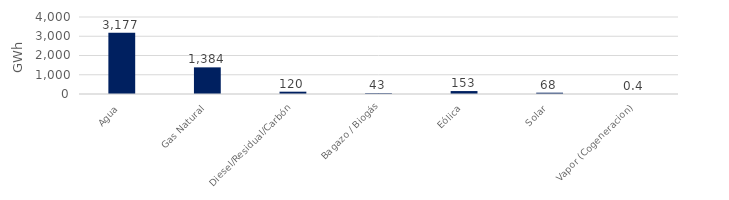
| Category | Series 0 |
|---|---|
| Agua | 3176.727 |
| Gas Natural | 1383.714 |
| Diesel/Residual/Carbón | 119.964 |
| Bagazo / Biogás | 42.784 |
| Eólica | 152.599 |
| Solar | 68.403 |
| Vapor (Cogeneracion) | 0.39 |